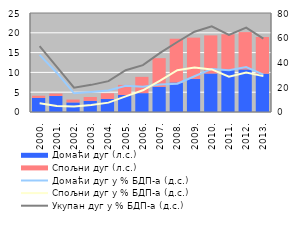
| Category | Домаћи дуг (л.с.) | Спољни дуг (л.с.) |
|---|---|---|
| 2000. | 3.56 | 0.546 |
| 2001. | 4.044 | 0.607 |
| 2002. | 2.417 | 0.727 |
| 2003. | 2.805 | 0.983 |
| 2004. | 3.294 | 1.436 |
| 2005. | 4.288 | 2.55 |
| 2006. | 4.764 | 4.113 |
| 2007. | 6.35 | 7.248 |
| 2008. | 7.458 | 11.043 |
| 2009. | 8.365 | 10.414 |
| 2010. | 9.73 | 9.617 |
| 2011. | 10.631 | 8.988 |
| 2012. | 10.75 | 9.434 |
| 2013. | 9.673 | 9.267 |